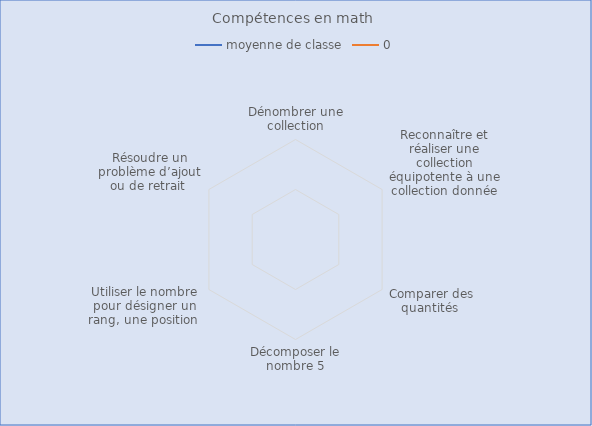
| Category | moyenne de classe | 0 |
|---|---|---|
| Dénombrer une collection | 0 |  |
| Reconnaître et réaliser une collection équipotente à une collection donnée | 0 |  |
| Comparer des quantités  | 0 |  |
| Décomposer le nombre 5 | 0 |  |
| Utiliser le nombre pour désigner un rang, une position  | 0 |  |
| Résoudre un problème d’ajout ou de retrait  | 0 |  |